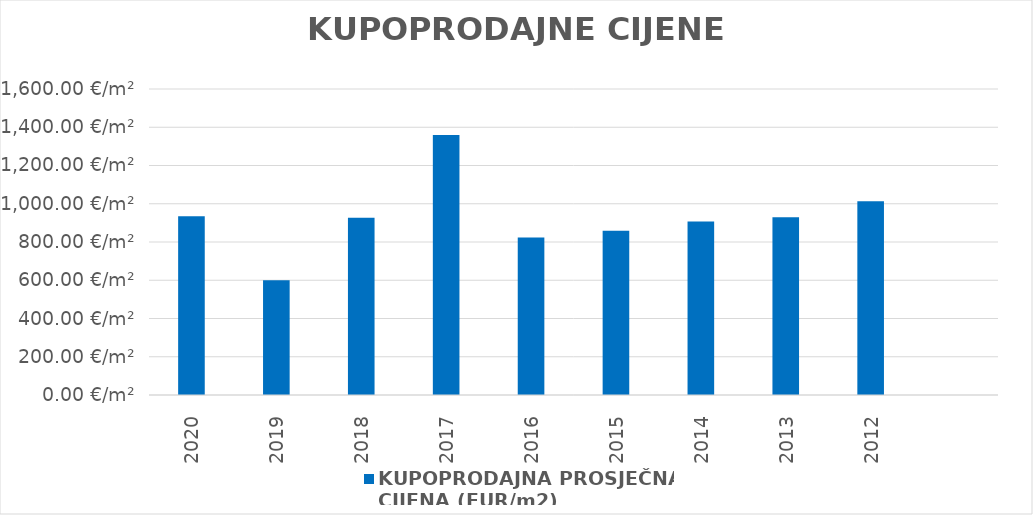
| Category | KUPOPRODAJNA PROSJEČNA 
CIJENA (EUR/m2) |
|---|---|
| 2020 | 1902-07-23 02:43:29 |
| 2019 | 1901-08-22 03:35:42 |
| 2018 | 1902-07-14 10:43:18 |
| 2017 | 1903-09-20 17:49:24 |
| 2016 | 1902-04-03 02:18:00 |
| 2015 | 1902-05-07 15:04:26 |
| 2014 | 1902-06-24 16:01:33 |
| 2013 | 1902-07-16 21:59:57 |
| 2012 | 1902-10-08 23:04:16 |